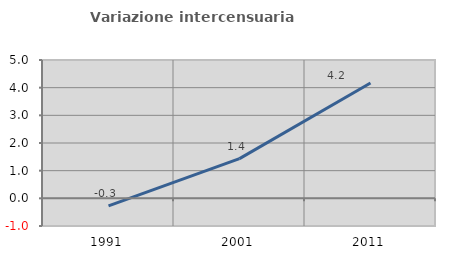
| Category | Variazione intercensuaria annua |
|---|---|
| 1991.0 | -0.271 |
| 2001.0 | 1.434 |
| 2011.0 | 4.171 |